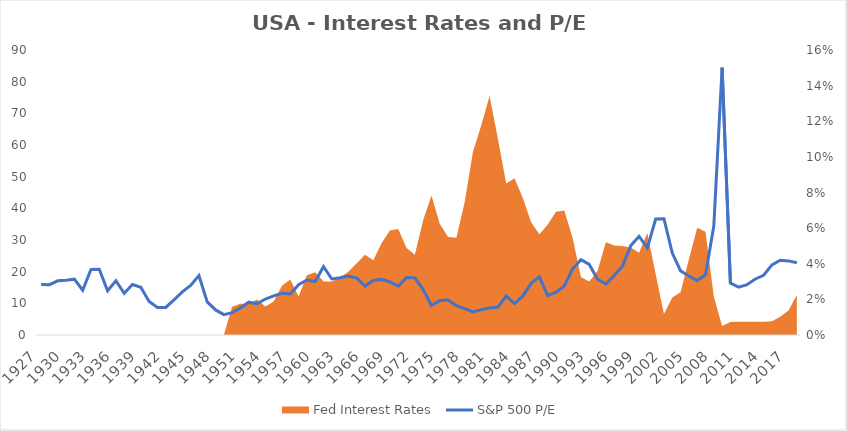
| Category | S&P 500 P/E |
|---|---|
| 1927.0 | 15.91 |
| 1928.0 | 15.901 |
| 1929.0 | 17.113 |
| 1930.0 | 17.256 |
| 1931.0 | 17.618 |
| 1932.0 | 14.138 |
| 1933.0 | 20.719 |
| 1934.0 | 20.761 |
| 1935.0 | 13.982 |
| 1936.0 | 17.154 |
| 1937.0 | 13.171 |
| 1938.0 | 15.952 |
| 1939.0 | 15.086 |
| 1940.0 | 10.578 |
| 1941.0 | 8.658 |
| 1942.0 | 8.698 |
| 1943.0 | 11.117 |
| 1944.0 | 13.6 |
| 1945.0 | 15.673 |
| 1946.0 | 18.75 |
| 1947.0 | 10.445 |
| 1948.0 | 7.921 |
| 1949.0 | 6.422 |
| 1950.0 | 7.054 |
| 1951.0 | 8.564 |
| 1952.0 | 10.373 |
| 1953.0 | 9.888 |
| 1954.0 | 11.357 |
| 1955.0 | 12.349 |
| 1956.0 | 13.144 |
| 1957.0 | 12.953 |
| 1958.0 | 15.865 |
| 1959.0 | 17.358 |
| 1960.0 | 16.866 |
| 1961.0 | 21.568 |
| 1962.0 | 17.694 |
| 1963.0 | 18.08 |
| 1964.0 | 18.608 |
| 1965.0 | 17.985 |
| 1966.0 | 15.47 |
| 1967.0 | 17.23 |
| 1968.0 | 17.561 |
| 1969.0 | 16.732 |
| 1970.0 | 15.451 |
| 1971.0 | 18.152 |
| 1972.0 | 18.045 |
| 1973.0 | 14.361 |
| 1974.0 | 9.33 |
| 1975.0 | 10.869 |
| 1976.0 | 11.023 |
| 1977.0 | 9.275 |
| 1978.0 | 8.302 |
| 1979.0 | 7.285 |
| 1980.0 | 8.022 |
| 1981.0 | 8.5 |
| 1982.0 | 8.786 |
| 1983.0 | 12.296 |
| 1984.0 | 9.926 |
| 1985.0 | 12.263 |
| 1986.0 | 16.32 |
| 1987.0 | 18.361 |
| 1988.0 | 12.445 |
| 1989.0 | 13.545 |
| 1990.0 | 15.475 |
| 1991.0 | 20.86 |
| 1992.0 | 23.774 |
| 1993.0 | 22.294 |
| 1994.0 | 17.618 |
| 1995.0 | 16.06 |
| 1996.0 | 18.787 |
| 1997.0 | 21.746 |
| 1998.0 | 28.221 |
| 1999.0 | 31.162 |
| 2000.0 | 27.492 |
| 2001.0 | 36.619 |
| 2002.0 | 36.677 |
| 2003.0 | 25.856 |
| 2004.0 | 20.246 |
| 2005.0 | 18.607 |
| 2006.0 | 17.174 |
| 2007.0 | 19.097 |
| 2008.0 | 34.403 |
| 2009.0 | 84.418 |
| 2010.0 | 16.405 |
| 2011.0 | 15.132 |
| 2012.0 | 15.874 |
| 2013.0 | 17.699 |
| 2014.0 | 18.868 |
| 2015.0 | 22.157 |
| 2016.0 | 23.599 |
| 2017.0 | 23.4 |
| 2018.0 | 22.791 |